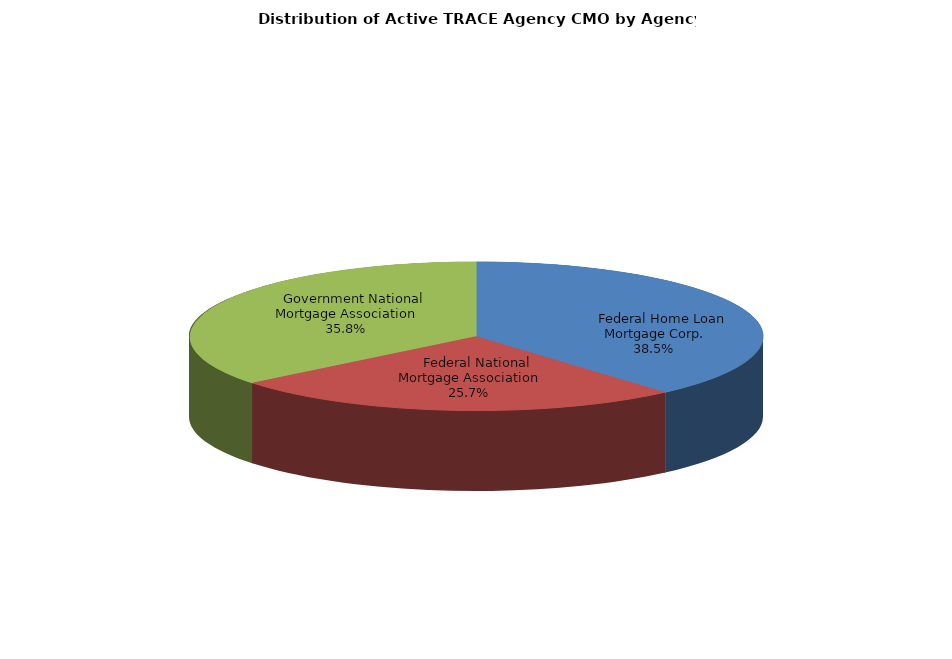
| Category | Series 0 |
|---|---|
|     Federal Home Loan Mortgage Corp. | 101106 |
|     Federal National Mortgage Association | 67365 |
|     Government National Mortgage Association | 93825 |